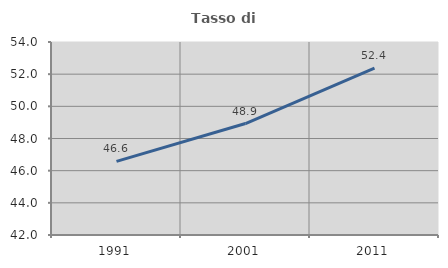
| Category | Tasso di occupazione   |
|---|---|
| 1991.0 | 46.575 |
| 2001.0 | 48.929 |
| 2011.0 | 52.381 |